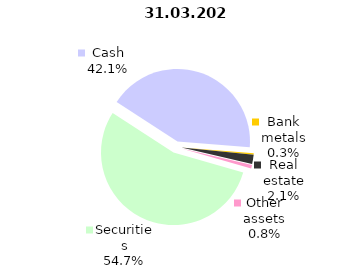
| Category | Total |
|---|---|
| Securities | 904.471 |
| Cash | 696.32 |
| Bank metals | 5.312 |
| Real estate | 34.47 |
| Other assets | 12.848 |